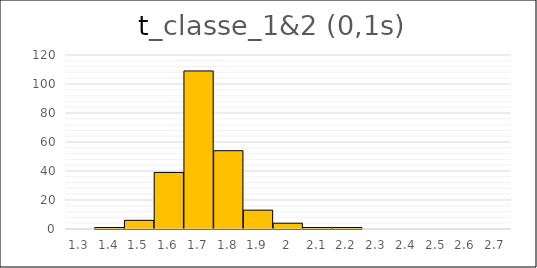
| Category | Series 0 |
|---|---|
| 1.3 | 0 |
| 1.4 | 1 |
| 1.5 | 6 |
| 1.6 | 39 |
| 1.7 | 109 |
| 1.8 | 54 |
| 1.9 | 13 |
| 2.0 | 4 |
| 2.1 | 1 |
| 2.2 | 1 |
| 2.3 | 0 |
| 2.4 | 0 |
| 2.5 | 0 |
| 2.6 | 0 |
| 2.7 | 0 |